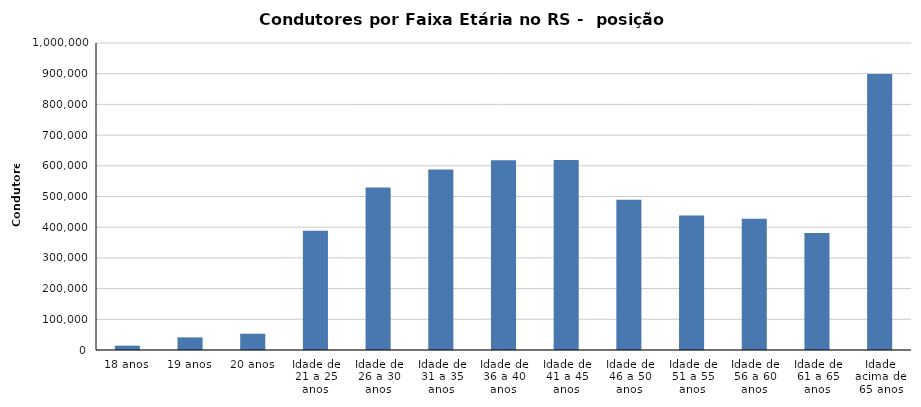
| Category | Condutores |
|---|---|
| 18 anos | 14186 |
| 19 anos | 41081 |
| 20 anos | 52996 |
| Idade de 21 a 25 anos | 388726 |
| Idade de 26 a 30 anos | 529307 |
| Idade de 31 a 35 anos | 588337 |
| Idade de 36 a 40 anos | 617723 |
| Idade de 41 a 45 anos | 618562 |
| Idade de 46 a 50 anos | 489748 |
| Idade de 51 a 55 anos | 438029 |
| Idade de 56 a 60 anos | 427126 |
| Idade de 61 a 65 anos | 381334 |
| Idade acima de 65 anos | 898621 |